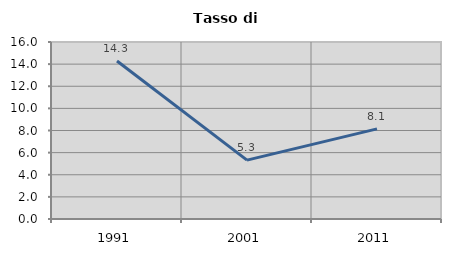
| Category | Tasso di disoccupazione   |
|---|---|
| 1991.0 | 14.286 |
| 2001.0 | 5.319 |
| 2011.0 | 8.148 |